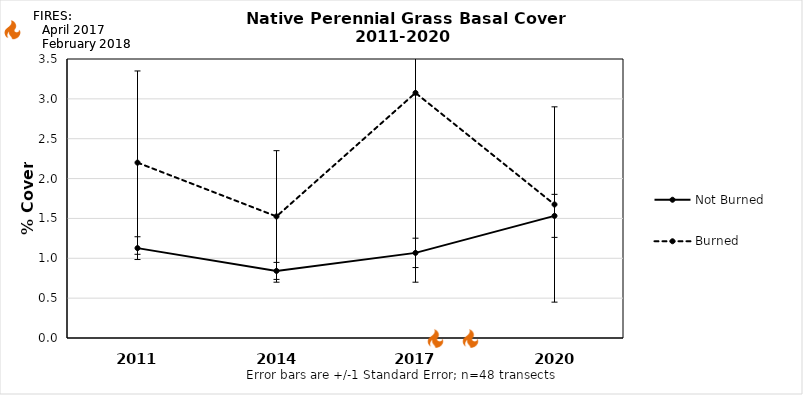
| Category | Not Burned | Burned |
|---|---|---|
| 2011.0 | 1.127 | 2.2 |
| 2014.0 | 0.842 | 1.525 |
| 2017.0 | 1.068 | 3.075 |
| 2020.0 | 1.532 | 1.675 |